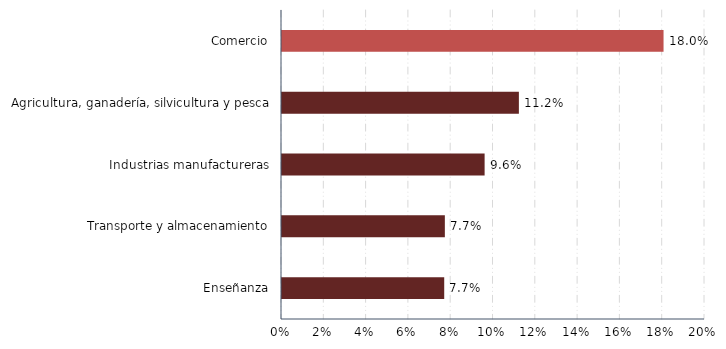
| Category | Series 0 |
|---|---|
| Enseñanza | 0.077 |
| Transporte y almacenamiento | 0.077 |
| Industrias manufactureras | 0.096 |
| Agricultura, ganadería, silvicultura y pesca | 0.112 |
| Comercio | 0.18 |